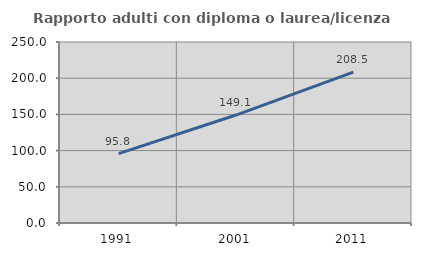
| Category | Rapporto adulti con diploma o laurea/licenza media  |
|---|---|
| 1991.0 | 95.829 |
| 2001.0 | 149.122 |
| 2011.0 | 208.459 |